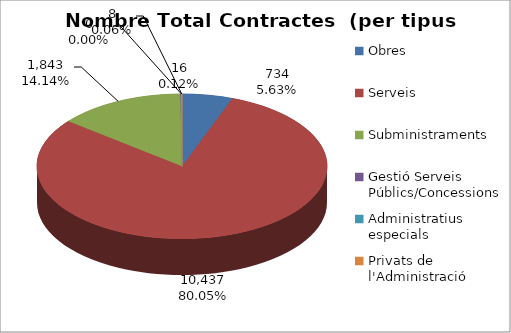
| Category | TOTALS per tipus contracte Nombre Total Contractes | TOTALS per tipus contracte % total contractes | TOTALS per tipus contracte Total Import (€) | TOTALS per tipus contracte % total import |
|---|---|---|---|---|
| Obres | 734 | 0.056 | 36848124.8 | 0.088 |
| Serveis | 10437 | 0.801 | 346305923.25 | 0.823 |
| Subministraments | 1843 | 0.141 | 34248927.38 | 0.081 |
| Gestió Serveis Públics/Concessions | 16 | 0.001 | 1923713.15 | 0.005 |
| Administratius especials | 0 | 0 | 0 | 0 |
| Privats de l'Administració | 8 | 0.001 | 1299951.44 | 0.003 |